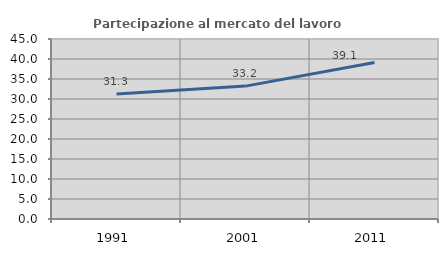
| Category | Partecipazione al mercato del lavoro  femminile |
|---|---|
| 1991.0 | 31.274 |
| 2001.0 | 33.223 |
| 2011.0 | 39.1 |